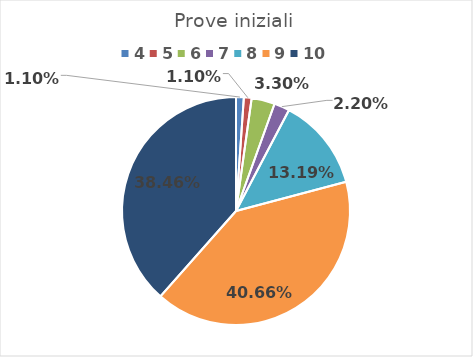
| Category | Series 0 |
|---|---|
| 4.0 | 0.011 |
| 5.0 | 0.011 |
| 6.0 | 0.033 |
| 7.0 | 0.022 |
| 8.0 | 0.132 |
| 9.0 | 0.407 |
| 10.0 | 0.385 |